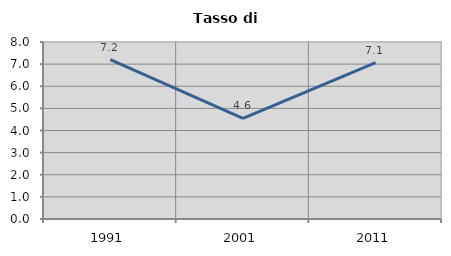
| Category | Tasso di disoccupazione   |
|---|---|
| 1991.0 | 7.202 |
| 2001.0 | 4.553 |
| 2011.0 | 7.068 |